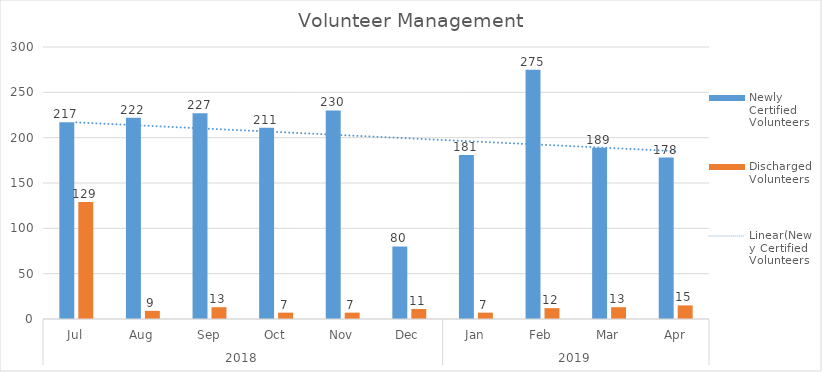
| Category | Newly Certified Volunteers  | Discharged Volunteers  |
|---|---|---|
| 0 | 217 | 129 |
| 1 | 222 | 9 |
| 2 | 227 | 13 |
| 3 | 211 | 7 |
| 4 | 230 | 7 |
| 5 | 80 | 11 |
| 6 | 181 | 7 |
| 7 | 275 | 12 |
| 8 | 189 | 13 |
| 9 | 178 | 15 |